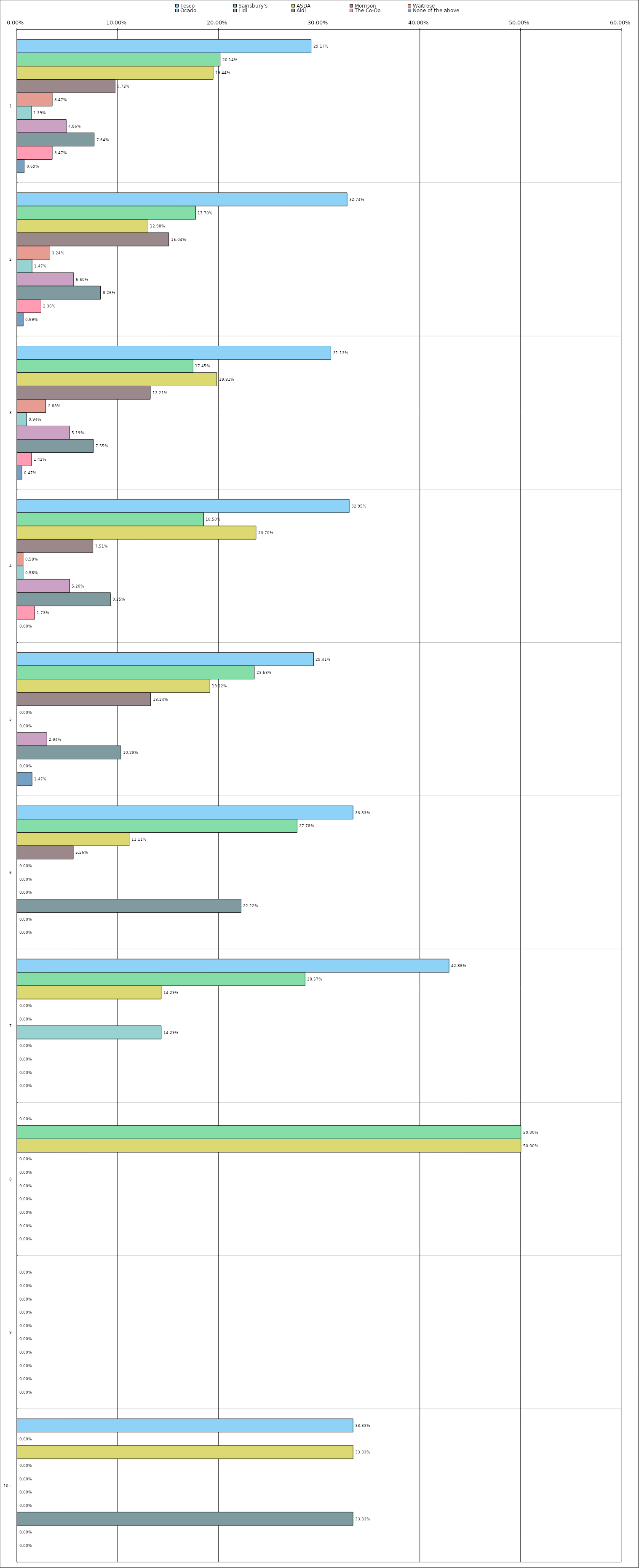
| Category | Tesco | Sainsbury's | ASDA | Morrison | Waitrose | Ocado | Lidl | Aldi | The Co-Op | None of the above |
|---|---|---|---|---|---|---|---|---|---|---|
| 0 | 0.292 | 0.201 | 0.194 | 0.097 | 0.035 | 0.014 | 0.049 | 0.076 | 0.035 | 0.007 |
| 1 | 0.327 | 0.177 | 0.13 | 0.15 | 0.032 | 0.015 | 0.056 | 0.083 | 0.024 | 0.006 |
| 2 | 0.311 | 0.174 | 0.198 | 0.132 | 0.028 | 0.009 | 0.052 | 0.076 | 0.014 | 0.005 |
| 3 | 0.33 | 0.185 | 0.237 | 0.075 | 0.006 | 0.006 | 0.052 | 0.092 | 0.017 | 0 |
| 4 | 0.294 | 0.235 | 0.191 | 0.132 | 0 | 0 | 0.029 | 0.103 | 0 | 0.015 |
| 5 | 0.333 | 0.278 | 0.111 | 0.056 | 0 | 0 | 0 | 0.222 | 0 | 0 |
| 6 | 0.429 | 0.286 | 0.143 | 0 | 0 | 0.143 | 0 | 0 | 0 | 0 |
| 7 | 0 | 0.5 | 0.5 | 0 | 0 | 0 | 0 | 0 | 0 | 0 |
| 8 | 0 | 0 | 0 | 0 | 0 | 0 | 0 | 0 | 0 | 0 |
| 9 | 0.333 | 0 | 0.333 | 0 | 0 | 0 | 0 | 0.333 | 0 | 0 |